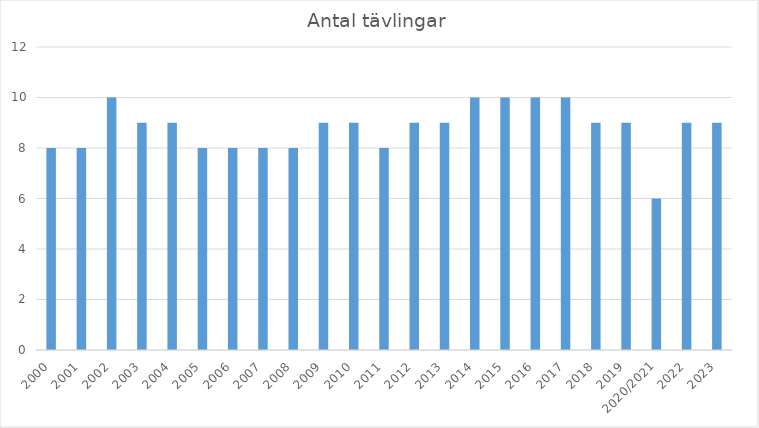
| Category | Antal tävlingar |
|---|---|
| 2000 | 8 |
| 2001 | 8 |
| 2002 | 10 |
| 2003 | 9 |
| 2004 | 9 |
| 2005 | 8 |
| 2006 | 8 |
| 2007 | 8 |
| 2008 | 8 |
| 2009 | 9 |
| 2010 | 9 |
| 2011 | 8 |
| 2012 | 9 |
| 2013 | 9 |
| 2014 | 10 |
| 2015 | 10 |
| 2016 | 10 |
| 2017 | 10 |
| 2018 | 9 |
| 2019 | 9 |
| 2020/2021 | 6 |
| 2022 | 9 |
| 2023 | 9 |